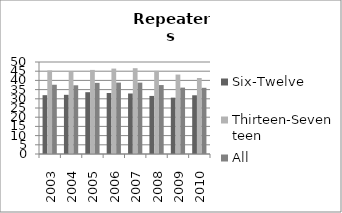
| Category | Six-Twelve | Thirteen-Seventeen | All |
|---|---|---|---|
| 2003.0 | 31.97 | 45.41 | 37.64 |
| 2004.0 | 32.16 | 44.55 | 37.34 |
| 2005.0 | 33.59 | 45.7 | 38.66 |
| 2006.0 | 33.16 | 46.42 | 38.8 |
| 2007.0 | 32.89 | 46.64 | 38.78 |
| 2008.0 | 31.56 | 45.19 | 37.47 |
| 2009.0 | 30.62 | 43.17 | 36.08 |
| 2010.0 | 31.91 | 41.32 | 35.98 |